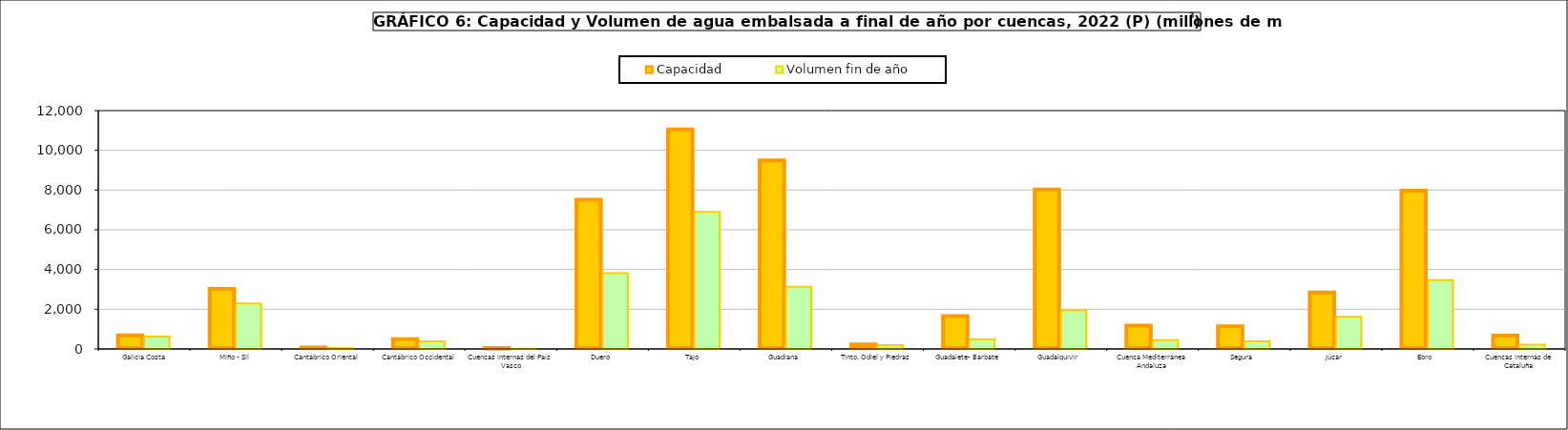
| Category | Capacidad | Volumen fin de año |
|---|---|---|
| Galicia Costa | 684 | 630 |
| Miño - Sil | 3030 | 2288 |
| Cantábrico Oriental | 73 | 49 |
| Cantábrico Occidental | 490 | 379 |
| Cuencas Internas del País Vasco | 21 | 13 |
| Duero  | 7507 | 3815 |
| Tajo  | 11056 | 6900 |
| Guadiana  | 9498 | 3137 |
| Tinto, Odiel y Piedras | 229 | 192 |
| Guadalete- Barbate | 1651 | 488 |
| Guadalquivir  | 8030 | 1946 |
| Cuenca Mediterránea Andaluza | 1174 | 445 |
| Segura  | 1140 | 387 |
| Júcar  | 2846 | 1624 |
| Ebro  | 7963 | 3472 |
| Cuencas internas de Cataluña | 677 | 212 |